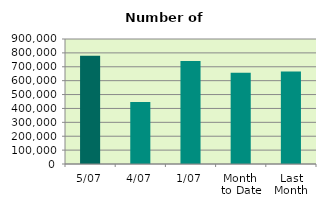
| Category | Series 0 |
|---|---|
| 5/07 | 779748 |
| 4/07 | 446414 |
| 1/07 | 742184 |
| Month 
to Date | 656115.333 |
| Last
Month | 666251.273 |